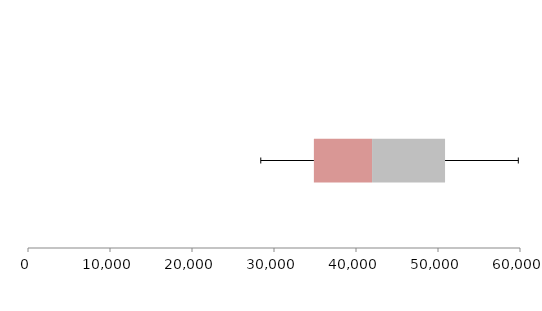
| Category | Series 1 | Series 2 | Series 3 |
|---|---|---|---|
| 0 | 34864.165 | 7093.449 | 8901.792 |